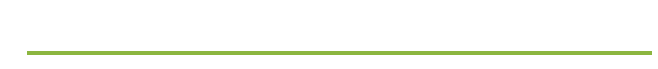
| Category | Awareness |
|---|---|
| 0 | 0 |